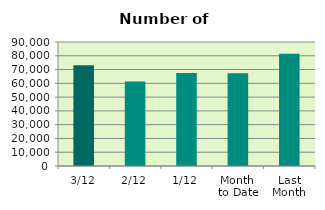
| Category | Series 0 |
|---|---|
| 3/12 | 73120 |
| 2/12 | 61382 |
| 1/12 | 67442 |
| Month 
to Date | 67314.667 |
| Last
Month | 81433.048 |